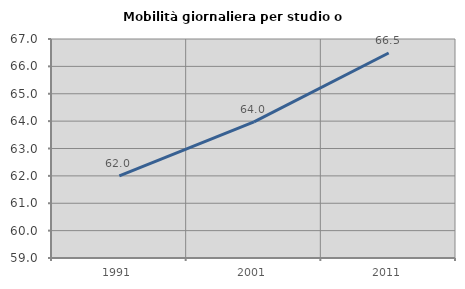
| Category | Mobilità giornaliera per studio o lavoro |
|---|---|
| 1991.0 | 62.004 |
| 2001.0 | 63.974 |
| 2011.0 | 66.488 |